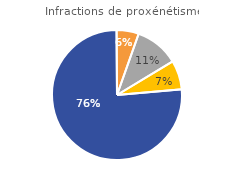
| Category | Infractions de proxénétisme |
|---|---|
| Instruction | 76.281 |
| COPJ* | 5.522 |
| Comparution immédiate | 10.946 |
| Autres | 7.251 |